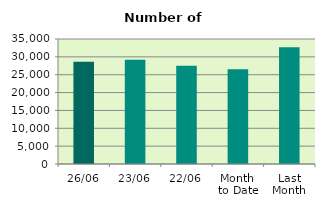
| Category | Series 0 |
|---|---|
| 26/06 | 28612 |
| 23/06 | 29184 |
| 22/06 | 27484 |
| Month 
to Date | 26499.222 |
| Last
Month | 32723.818 |